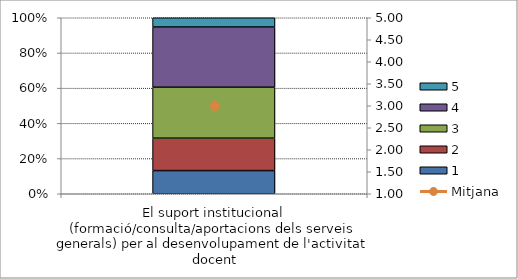
| Category | 1 | 2 | 3 | 4 | 5 |
|---|---|---|---|---|---|
| El suport institucional (formació/consulta/aportacions dels serveis generals) per al desenvolupament de l'activitat docent | 5 | 7 | 11 | 13 | 2 |